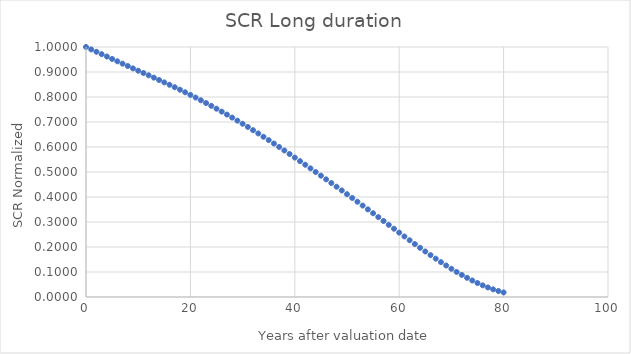
| Category |  SCR Norm  |
|---|---|
| 0.0 | 1 |
| 1.0 | 0.99 |
| 2.0 | 0.981 |
| 3.0 | 0.971 |
| 4.0 | 0.962 |
| 5.0 | 0.952 |
| 6.0 | 0.943 |
| 7.0 | 0.933 |
| 8.0 | 0.924 |
| 9.0 | 0.914 |
| 10.0 | 0.905 |
| 11.0 | 0.896 |
| 12.0 | 0.887 |
| 13.0 | 0.877 |
| 14.0 | 0.868 |
| 15.0 | 0.858 |
| 16.0 | 0.849 |
| 17.0 | 0.839 |
| 18.0 | 0.829 |
| 19.0 | 0.819 |
| 20.0 | 0.808 |
| 21.0 | 0.798 |
| 22.0 | 0.787 |
| 23.0 | 0.776 |
| 24.0 | 0.765 |
| 25.0 | 0.753 |
| 26.0 | 0.742 |
| 27.0 | 0.73 |
| 28.0 | 0.718 |
| 29.0 | 0.705 |
| 30.0 | 0.693 |
| 31.0 | 0.68 |
| 32.0 | 0.667 |
| 33.0 | 0.654 |
| 34.0 | 0.641 |
| 35.0 | 0.628 |
| 36.0 | 0.614 |
| 37.0 | 0.6 |
| 38.0 | 0.586 |
| 39.0 | 0.572 |
| 40.0 | 0.558 |
| 41.0 | 0.543 |
| 42.0 | 0.529 |
| 43.0 | 0.515 |
| 44.0 | 0.5 |
| 45.0 | 0.485 |
| 46.0 | 0.471 |
| 47.0 | 0.456 |
| 48.0 | 0.441 |
| 49.0 | 0.426 |
| 50.0 | 0.411 |
| 51.0 | 0.396 |
| 52.0 | 0.381 |
| 53.0 | 0.366 |
| 54.0 | 0.35 |
| 55.0 | 0.335 |
| 56.0 | 0.32 |
| 57.0 | 0.304 |
| 58.0 | 0.289 |
| 59.0 | 0.273 |
| 60.0 | 0.258 |
| 61.0 | 0.242 |
| 62.0 | 0.227 |
| 63.0 | 0.212 |
| 64.0 | 0.197 |
| 65.0 | 0.182 |
| 66.0 | 0.168 |
| 67.0 | 0.153 |
| 68.0 | 0.139 |
| 69.0 | 0.126 |
| 70.0 | 0.113 |
| 71.0 | 0.1 |
| 72.0 | 0.088 |
| 73.0 | 0.077 |
| 74.0 | 0.066 |
| 75.0 | 0.056 |
| 76.0 | 0.047 |
| 77.0 | 0.038 |
| 78.0 | 0.031 |
| 79.0 | 0.024 |
| 80.0 | 0.018 |